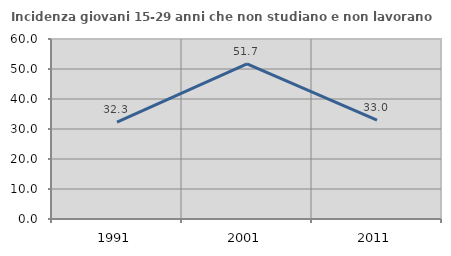
| Category | Incidenza giovani 15-29 anni che non studiano e non lavorano  |
|---|---|
| 1991.0 | 32.271 |
| 2001.0 | 51.724 |
| 2011.0 | 32.963 |